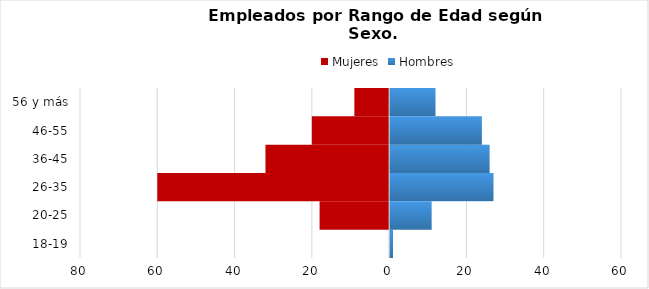
| Category | Mujeres | Hombres |
|---|---|---|
| 18-19 | 0 | 1 |
| 20-25 | -18 | 11 |
| 26-35 | -60 | 27 |
| 36-45 | -32 | 26 |
| 46-55 | -20 | 24 |
| 56 y más | -9 | 12 |